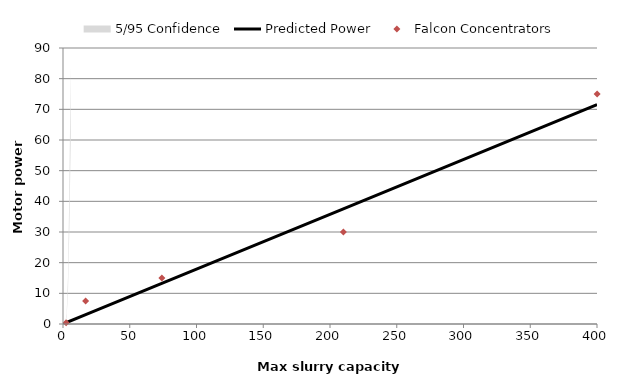
| Category | Series 2 | 5/95 Confidence |
|---|---|---|
| 0.0 | 0 | 0 |
| 2.3 | 0.345 | 0.134 |
| 17.0 | 2.546 | 0.989 |
| 74.0 | 11.084 | 4.304 |
| 210.0 | 31.454 | 12.215 |
| 400.0 | 59.913 | 23.266 |